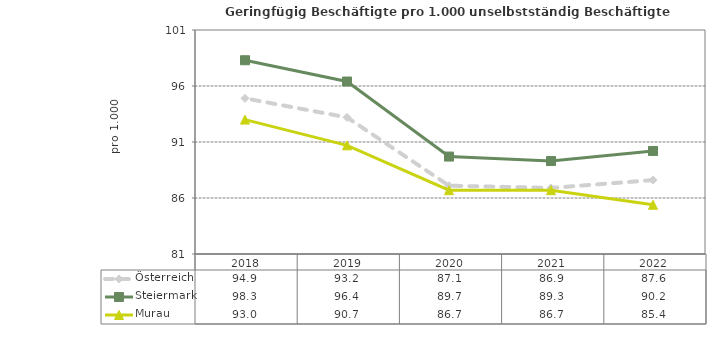
| Category | Österreich | Steiermark | Murau |
|---|---|---|---|
| 2022.0 | 87.6 | 90.2 | 85.4 |
| 2021.0 | 86.9 | 89.3 | 86.7 |
| 2020.0 | 87.1 | 89.7 | 86.7 |
| 2019.0 | 93.2 | 96.4 | 90.7 |
| 2018.0 | 94.9 | 98.3 | 93 |